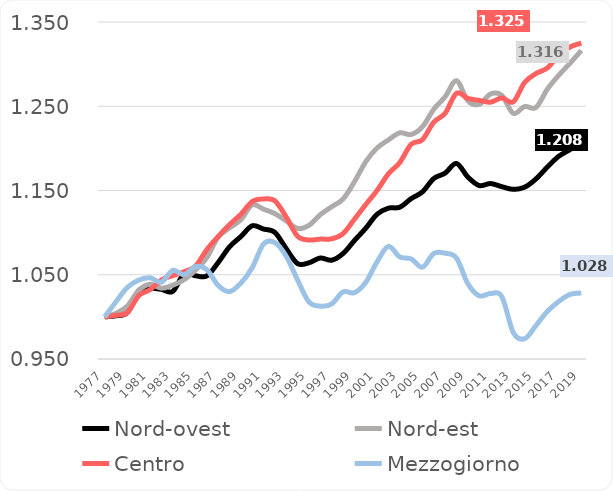
| Category | Nord-ovest | Nord-est | Centro | Mezzogiorno |
|---|---|---|---|---|
| 1977 | 1 | 1 | 1 | 1 |
| 1978 | 1.001 | 1.004 | 1.002 | 1.018 |
| 1979 | 1.005 | 1.013 | 1.005 | 1.035 |
| 1980 | 1.031 | 1.031 | 1.025 | 1.044 |
| 1981 | 1.034 | 1.039 | 1.032 | 1.046 |
| 1982 | 1.033 | 1.034 | 1.044 | 1.041 |
| 1983 | 1.03 | 1.038 | 1.049 | 1.055 |
| 1984 | 1.051 | 1.044 | 1.054 | 1.05 |
| 1985 | 1.049 | 1.055 | 1.06 | 1.06 |
| 1986 | 1.049 | 1.07 | 1.08 | 1.056 |
| 1987 | 1.064 | 1.095 | 1.095 | 1.037 |
| 1988 | 1.083 | 1.106 | 1.109 | 1.03 |
| 1989 | 1.095 | 1.115 | 1.122 | 1.04 |
| 1990 | 1.108 | 1.133 | 1.137 | 1.058 |
| 1991 | 1.104 | 1.128 | 1.14 | 1.086 |
| 1992 | 1.1 | 1.123 | 1.138 | 1.088 |
| 1993 | 1.081 | 1.114 | 1.118 | 1.072 |
| 1994 | 1.063 | 1.105 | 1.096 | 1.044 |
| 1995 | 1.064 | 1.109 | 1.091 | 1.018 |
| 1996 | 1.07 | 1.121 | 1.092 | 1.013 |
| 1997 | 1.067 | 1.131 | 1.093 | 1.015 |
| 1998 | 1.075 | 1.14 | 1.099 | 1.03 |
| 1999 | 1.09 | 1.16 | 1.116 | 1.029 |
| 2000 | 1.105 | 1.184 | 1.133 | 1.041 |
| 2001 | 1.122 | 1.2 | 1.15 | 1.065 |
| 2002 | 1.129 | 1.21 | 1.17 | 1.084 |
| 2003 | 1.13 | 1.218 | 1.183 | 1.071 |
| 2004 | 1.14 | 1.216 | 1.205 | 1.069 |
| 2005 | 1.148 | 1.226 | 1.21 | 1.059 |
| 2006 | 1.164 | 1.246 | 1.231 | 1.075 |
| 2007 | 1.171 | 1.261 | 1.242 | 1.076 |
| 2008 | 1.182 | 1.28 | 1.265 | 1.07 |
| 2009 | 1.166 | 1.256 | 1.259 | 1.039 |
| 2010 | 1.156 | 1.252 | 1.257 | 1.025 |
| 2011 | 1.158 | 1.265 | 1.255 | 1.028 |
| 2012 | 1.155 | 1.263 | 1.26 | 1.024 |
| 2013 | 1.151 | 1.242 | 1.255 | 0.981 |
| 2014 | 1.154 | 1.25 | 1.278 | 0.974 |
| 2015 | 1.164 | 1.249 | 1.289 | 0.99 |
| 2016 | 1.178 | 1.27 | 1.295 | 1.006 |
| 2017 | 1.191 | 1.287 | 1.31 | 1.018 |
| 2018 | 1.199 | 1.301 | 1.32 | 1.027 |
| 2019 | 1.208 | 1.316 | 1.325 | 1.028 |